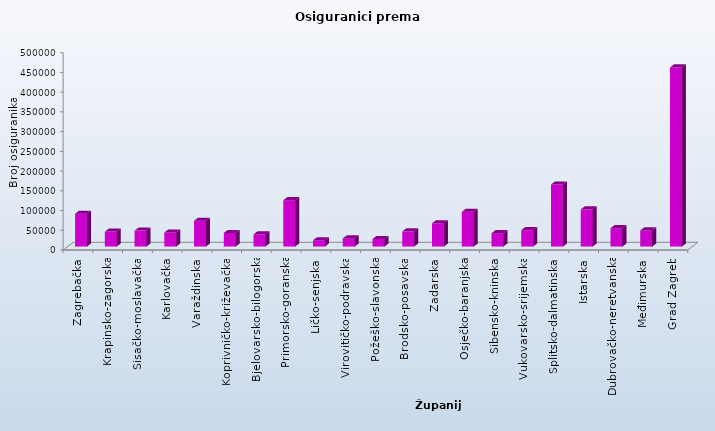
| Category | Series 0 |
|---|---|
| Zagrebačka | 83173 |
| Krapinsko-zagorska | 37899 |
| Sisačko-moslavačka | 40374 |
| Karlovačka | 35624 |
| Varaždinska | 65385 |
| Koprivničko-križevačka | 34313 |
| Bjelovarsko-bilogorska | 31023 |
| Primorsko-goranska | 117455 |
| Ličko-senjska | 15914 |
| Virovitičko-podravska | 20689 |
| Požeško-slavonska | 19053 |
| Brodsko-posavska | 38446 |
| Zadarska | 58974 |
| Osječko-baranjska | 87986 |
| Šibensko-kninska | 33821 |
| Vukovarsko-srijemska | 41659 |
| Splitsko-dalmatinska | 157114 |
| Istarska | 94207 |
| Dubrovačko-neretvanska | 46474 |
| Međimurska | 40821 |
| Grad Zagreb | 453926 |